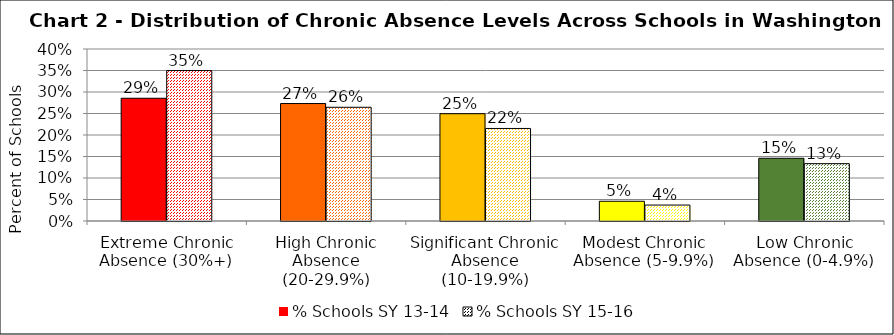
| Category | % Schools SY 13-14 | % Schools SY 15-16 |
|---|---|---|
| Extreme Chronic Absence (30%+) | 0.285 | 0.35 |
| High Chronic Absence (20-29.9%) | 0.273 | 0.264 |
| Significant Chronic Absence (10-19.9%) | 0.25 | 0.215 |
| Modest Chronic Absence (5-9.9%) | 0.046 | 0.037 |
| Low Chronic Absence (0-4.9%) | 0.146 | 0.133 |